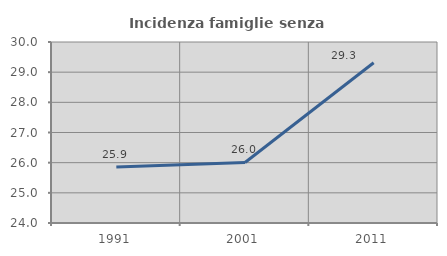
| Category | Incidenza famiglie senza nuclei |
|---|---|
| 1991.0 | 25.856 |
| 2001.0 | 26.007 |
| 2011.0 | 29.31 |